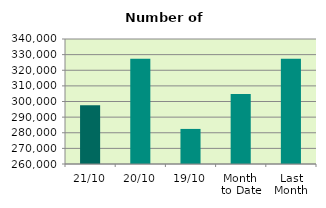
| Category | Series 0 |
|---|---|
| 21/10 | 297548 |
| 20/10 | 327286 |
| 19/10 | 282450 |
| Month 
to Date | 304854.133 |
| Last
Month | 327317.909 |